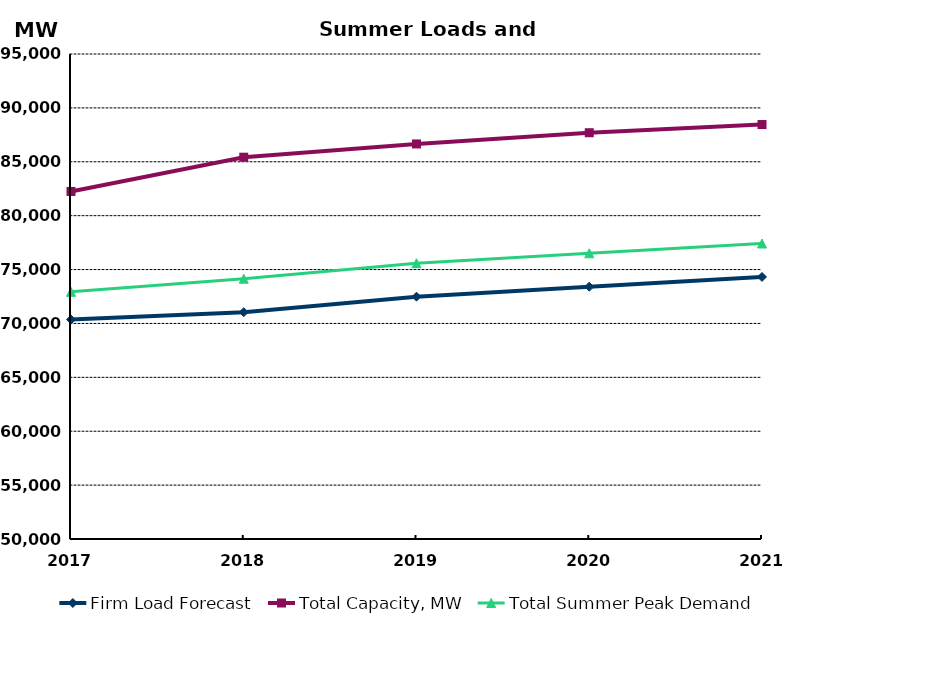
| Category | Firm Load Forecast | Total Capacity, MW | Total Summer Peak Demand |
|---|---|---|---|
| 2017.0 | 70361.463 | 82246.348 | 72933.55 |
| 2018.0 | 71043.958 | 85424.521 | 74149.387 |
| 2019.0 | 72482.9 | 86654.683 | 75588.33 |
| 2020.0 | 73404.863 | 87694.803 | 76510.293 |
| 2021.0 | 74311.82 | 88455.803 | 77417.25 |